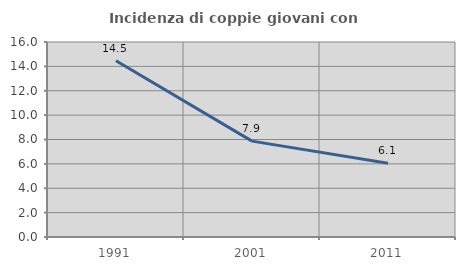
| Category | Incidenza di coppie giovani con figli |
|---|---|
| 1991.0 | 14.46 |
| 2001.0 | 7.866 |
| 2011.0 | 6.052 |